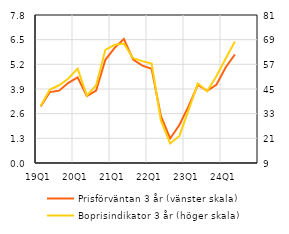
| Category | Prisförväntan 3 år (vänster skala) |
|---|---|
| 19Q1 | 2.974 |
| 19Q2 | 3.739 |
| 19Q3 | 3.812 |
| 19Q4 | 4.224 |
| 20Q1 | 4.51 |
| 20Q2 | 3.522 |
| 20Q3 | 3.812 |
| 20Q4 | 5.439 |
| 21Q1 | 6.071 |
| 21Q2 | 6.539 |
| 21Q3 | 5.448 |
| 21Q4 | 5.131 |
| 22Q1 | 4.962 |
| 22Q2 | 2.478 |
| 22Q3 | 1.293 |
| 22Q4 | 2.004 |
| 23Q1 | 2.998 |
| 23Q2 | 4.114 |
| 23Q3 | 3.807 |
| 23Q4 | 4.121 |
| 24Q1 | 5.037 |
| 24Q2 | 5.717 |